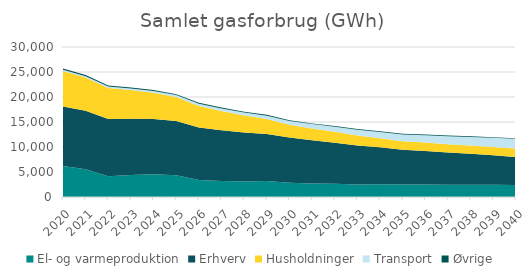
| Category | El- og varmeproduktion | Erhverv | Husholdninger | Transport | Øvrige |
|---|---|---|---|---|---|
| 2020.0 | 6187.026 | 11902.642 | 7106.393 | 271.533 | 229.692 |
| 2021.0 | 5547.746 | 11692.224 | 6641.703 | 279.679 | 221.857 |
| 2022.0 | 4126.368 | 11481.806 | 6177.013 | 294.544 | 214.022 |
| 2023.0 | 4399.803 | 11271.387 | 5712.324 | 316.887 | 206.187 |
| 2024.0 | 4549.69 | 11060.969 | 5247.634 | 348.864 | 198.353 |
| 2025.0 | 4354.651 | 10850.55 | 4782.944 | 387.866 | 190.518 |
| 2026.0 | 3394.887 | 10495.604 | 4328.37 | 441.224 | 182.49 |
| 2027.0 | 3185.931 | 10140.657 | 3873.796 | 507.008 | 174.463 |
| 2028.0 | 3100.78 | 9785.711 | 3419.221 | 585.931 | 166.435 |
| 2029.0 | 3194.172 | 9430.764 | 2964.647 | 678.162 | 158.407 |
| 2030.0 | 2844.511 | 9075.818 | 2510.073 | 783.057 | 150.38 |
| 2031.0 | 2681.741 | 8656.085 | 2341.876 | 898.781 | 144.913 |
| 2032.0 | 2634.116 | 8236.352 | 2173.679 | 1016.584 | 139.447 |
| 2033.0 | 2490.814 | 7816.619 | 2005.482 | 1134.86 | 133.98 |
| 2034.0 | 2532.048 | 7396.885 | 1837.285 | 1253.365 | 128.514 |
| 2035.0 | 2493.492 | 6977.152 | 1669.088 | 1367.914 | 123.047 |
| 2036.0 | 2504.637 | 6704.133 | 1672.58 | 1485.333 | 121.346 |
| 2037.0 | 2461.615 | 6431.114 | 1676.071 | 1599.429 | 119.644 |
| 2038.0 | 2473.381 | 6158.095 | 1679.563 | 1713.368 | 117.943 |
| 2039.0 | 2447.381 | 5885.076 | 1683.054 | 1827.125 | 116.242 |
| 2040.0 | 2396.186 | 5612.057 | 1686.546 | 1938.432 | 114.54 |